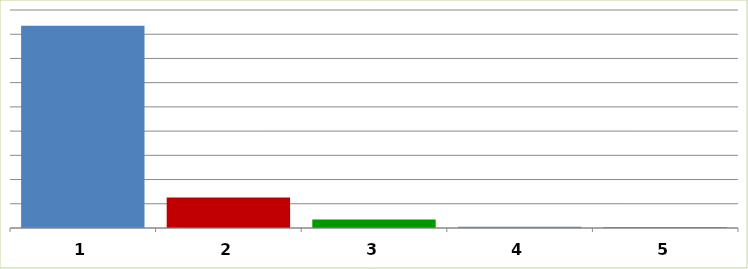
| Category | Series 0 |
|---|---|
| 0 | 83469672.33 |
| 1 | 12551561.7 |
| 2 | 3559353.46 |
| 3 | 530677.6 |
| 4 | 449231.45 |